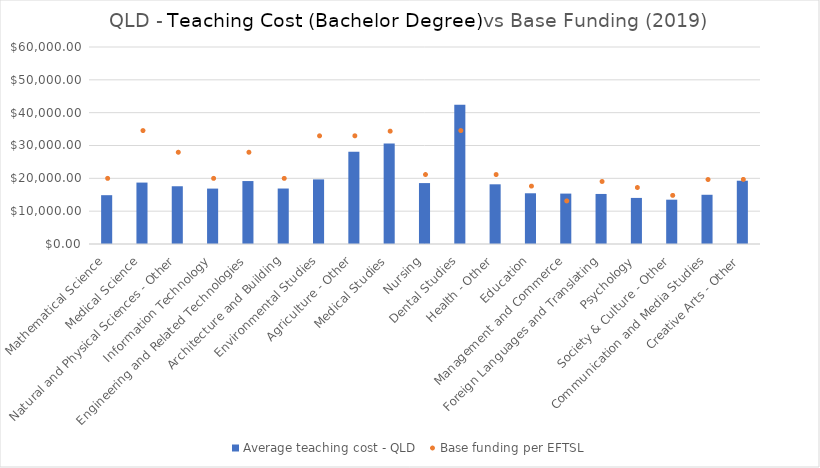
| Category | Average teaching cost - QLD  |
|---|---|
| Mathematical Science | 14868.806 |
| Medical Science | 18706.914 |
| Natural and Physical Sciences - Other | 17586.762 |
| Information Technology | 16875.112 |
| Engineering and Related Technologies | 19172.264 |
| Architecture and Building | 16896.015 |
| Environmental Studies | 19674.655 |
| Agriculture - Other | 28076.69 |
| Medical Studies | 30644.922 |
| Nursing | 18554.065 |
| Dental Studies | 42440.586 |
| Health - Other | 18182.06 |
| Education | 15450.224 |
| Management and Commerce | 15351.521 |
| Foreign Languages and Translating | 15243.45 |
| Psychology | 14034.195 |
| Society & Culture - Other | 13496.402 |
| Communication and Media Studies | 14992.231 |
| Creative Arts - Other | 19274.333 |